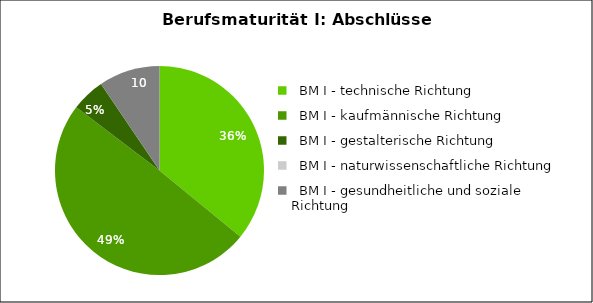
| Category | Series 0 |
|---|---|
|   BM I - technische Richtung | 186 |
|   BM I - kaufmännische Richtung                | 256 |
|   BM I - gestalterische Richtung               | 27 |
|   BM I - naturwissenschaftliche Richtung      | 0 |
|   BM I - gesundheitliche und soziale Richtung  | 49 |